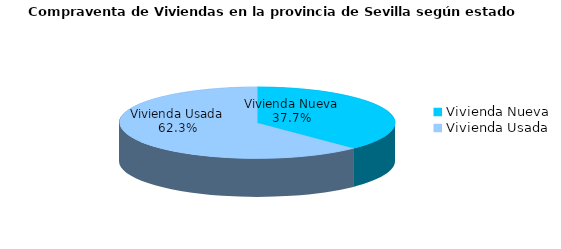
| Category | Series 0 | Series 1 |
|---|---|---|
| Vivienda Nueva | 298 | 0.377 |
| Vivienda Usada | 492 | 0.623 |